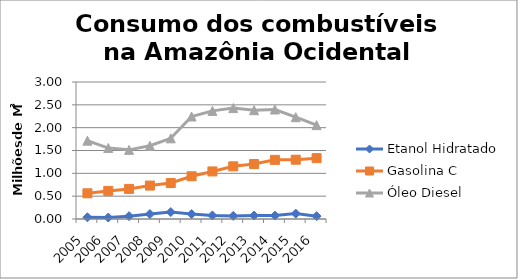
| Category | Etanol Hidratado | Gasolina C | Óleo Diesel |
|---|---|---|---|
| 2005.0 | 37381.206 | 562605.721 | 1714749.747 |
| 2006.0 | 32318.736 | 615313.658 | 1553445.421 |
| 2007.0 | 62668.474 | 658990.87 | 1514004.297 |
| 2008.0 | 107664.302 | 731980.733 | 1603602.314 |
| 2009.0 | 151648.481 | 787280.154 | 1766746.453 |
| 2010.0 | 107207.258 | 935586.295 | 2244217.448 |
| 2011.0 | 78097.852 | 1041787.249 | 2367454.929 |
| 2012.0 | 67440.244 | 1153088.786 | 2429026.815 |
| 2013.0 | 75606.389 | 1203403.443 | 2382553.734 |
| 2014.0 | 74226.552 | 1295268.165 | 2397943.741 |
| 2015.0 | 118082.022 | 1298207.545 | 2229213.302 |
| 2016.0 | 61951.663 | 1332507.812 | 2055463.419 |